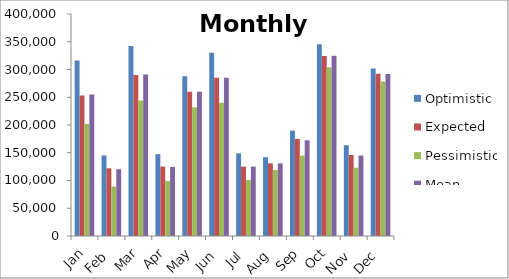
| Category | Optimistic | Expected | Pessimistic | Mean |
|---|---|---|---|---|
| Jan | 316000 | 253000 | 202000 | 255000 |
| Feb | 145200 | 122000 | 89000 | 120366.667 |
| Mar | 342500 | 290000 | 244000 | 291083.333 |
| Apr | 147500 | 125000 | 99000 | 124416.667 |
| May | 288000 | 260000 | 232000 | 260000 |
| Jun | 330000 | 285000 | 240000 | 285000 |
| Jul | 149000 | 125000 | 101000 | 125000 |
| Aug | 142000 | 131000 | 119000 | 130833.333 |
| Sep | 189900 | 175000 | 145000 | 172483.333 |
| Oct | 345700 | 324500 | 303900 | 324600 |
| Nov | 163500 | 146000 | 123000 | 145083.333 |
| Dec | 302000 | 292400 | 278500 | 291683.333 |